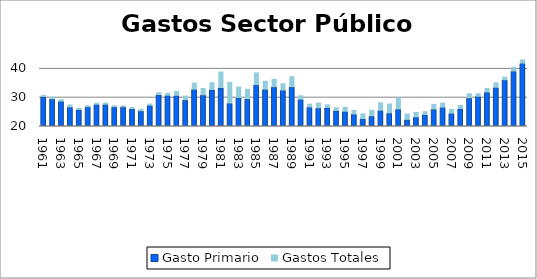
| Category | Gasto Primario | Gastos Totales |
|---|---|---|
| 1961.0 | 30.1 | 0.67 |
| 1962.0 | 29.31 | 0.85 |
| 1963.0 | 28.47 | 0.79 |
| 1964.0 | 26.47 | 1 |
| 1965.0 | 25.59 | 0.69 |
| 1966.0 | 26.54 | 0.65 |
| 1967.0 | 27.4 | 0.67 |
| 1968.0 | 27.41 | 0.72 |
| 1969.0 | 26.56 | 0.61 |
| 1970.0 | 26.54 | 0.59 |
| 1971.0 | 25.89 | 0.66 |
| 1972.0 | 25.15 | 0.8 |
| 1973.0 | 27.06 | 0.76 |
| 1974.0 | 30.76 | 0.91 |
| 1975.0 | 30.52 | 0.98 |
| 1976.0 | 30.5 | 1.61 |
| 1977.0 | 28.98 | 1.61 |
| 1978.0 | 32.62 | 2.45 |
| 1979.0 | 30.68 | 2.52 |
| 1980.0 | 32.52 | 2.68 |
| 1981.0 | 33.22 | 5.69 |
| 1982.0 | 27.81 | 7.52 |
| 1983.0 | 29.73 | 3.93 |
| 1984.0 | 29.33 | 3.59 |
| 1985.0 | 34.2 | 4.39 |
| 1986.0 | 32.63 | 3.07 |
| 1987.0 | 33.49 | 2.88 |
| 1988.0 | 32.32 | 2.53 |
| 1989.0 | 33.5 | 3.8 |
| 1990.0 | 29.15 | 1.51 |
| 1991.0 | 26.46 | 1.29 |
| 1992.0 | 26.16 | 1.97 |
| 1993.0 | 26.29 | 1.23 |
| 1994.0 | 25.23 | 1.28 |
| 1995.0 | 24.97 | 1.68 |
| 1996.0 | 24.01 | 1.55 |
| 1997.0 | 22.43 | 1.95 |
| 1998.0 | 23.39 | 2.24 |
| 1999.0 | 25.32 | 2.89 |
| 2000.0 | 24.42 | 3.4 |
| 2001.0 | 25.76 | 4.17 |
| 2002.0 | 22.15 | 2.18 |
| 2003.0 | 23 | 1.89 |
| 2004.0 | 23.83 | 1.3 |
| 2005.0 | 25.75 | 1.93 |
| 2006.0 | 26.38 | 1.75 |
| 2007.0 | 24.315 | 1.599 |
| 2008.0 | 25.936 | 1.392 |
| 2009.0 | 29.65 | 1.73 |
| 2010.0 | 30.173 | 1.218 |
| 2011.0 | 31.64 | 1.539 |
| 2012.0 | 33.293 | 1.851 |
| 2013.0 | 35.911 | 1.233 |
| 2014.0 | 38.946 | 1.613 |
| 2015.0 | 41.673 | 1.457 |